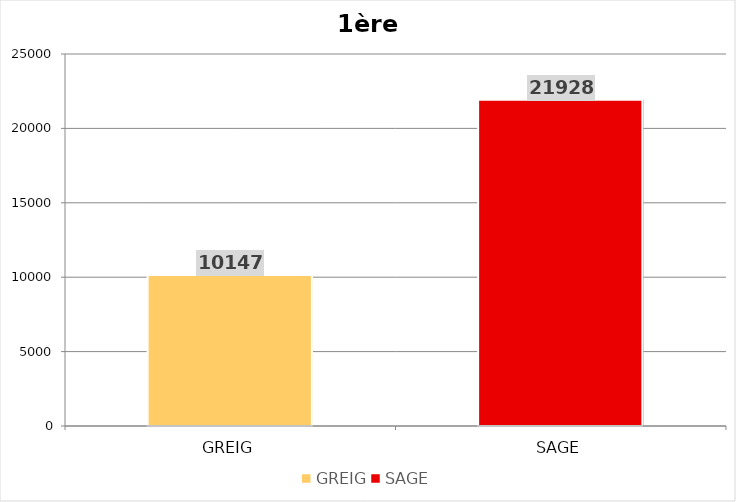
| Category | Series 0 |
|---|---|
| GREIG | 10147 |
| SAGE | 21928 |